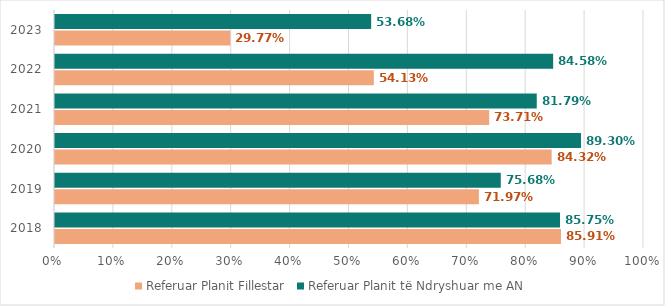
| Category | Referuar Planit Fillestar | Referuar Planit të Ndryshuar me AN |
|---|---|---|
| 2018.0 | 0.859 | 0.857 |
| 2019.0 | 0.72 | 0.757 |
| 2020.0 | 0.843 | 0.893 |
| 2021.0 | 0.737 | 0.818 |
| 2022.0 | 0.541 | 0.846 |
| 2023.0 | 0.298 | 0.537 |